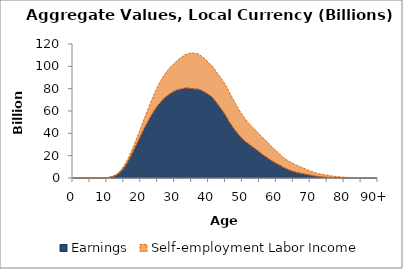
| Category | Earnings | Self-employment Labor Income |
|---|---|---|
| 0 | 0 | 0 |
|  | 0 | 0 |
| 2 | 0 | 0 |
| 3 | 0 | 0 |
| 4 | 0 | 0 |
| 5 | 0 | 0 |
| 6 | 0 | 46.946 |
| 7 | 13.755 | 57.827 |
| 8 | 30.216 | 68.766 |
| 9 | 80.733 | 88.635 |
| 10 | 242.605 | 141.063 |
| 11 | 635.234 | 264.901 |
| 12 | 1421.677 | 516.878 |
| 13 | 2877.866 | 894.584 |
| 14 | 5270.261 | 1371.116 |
| 15 | 8850.062 | 1891.014 |
| 16 | 13448.758 | 2542.195 |
| 17 | 19103.611 | 3258.36 |
| 18 | 25214.749 | 4193.669 |
| 19 | 31665.635 | 5337.689 |
| 20 | 38024.148 | 6816.653 |
| 21 | 44280.08 | 8634.969 |
| 22 | 50017.447 | 10629.712 |
| 23 | 55490.55 | 12769.163 |
| 24 | 60393.669 | 15115.114 |
| 25 | 64831.057 | 17343.843 |
| 26 | 68375.462 | 19229.897 |
| 27 | 71663.163 | 21035.345 |
| 28 | 74050.776 | 22698.869 |
| 29 | 76136.7 | 24008.529 |
| 30 | 77760.376 | 25029.531 |
| 31 | 79219.066 | 26713.715 |
| 32 | 79638.124 | 28309.643 |
| 33 | 80585.312 | 29675.202 |
| 34 | 80531.268 | 30710.684 |
| 35 | 80089.726 | 31962.208 |
| 36 | 79537.963 | 31940.647 |
| 37 | 79585.012 | 31512.155 |
| 38 | 78234.192 | 30672.341 |
| 39 | 76609.497 | 29803.486 |
| 40 | 74780.603 | 28633.872 |
| 41 | 72638.245 | 27865.154 |
| 42 | 68858.409 | 27586.392 |
| 43 | 64761.75 | 27476.864 |
| 44 | 60658.342 | 27557.091 |
| 45 | 56084.006 | 27397.742 |
| 46 | 50886.147 | 26976.225 |
| 47 | 46228.097 | 25787.208 |
| 48 | 42061.125 | 24380.039 |
| 49 | 38274.128 | 22727.387 |
| 50 | 34967.393 | 21359.149 |
| 51 | 32339.606 | 19787.309 |
| 52 | 29971.611 | 18630.016 |
| 53 | 27840.06 | 17712.983 |
| 54 | 25559.453 | 16885.153 |
| 55 | 23254.353 | 15812.603 |
| 56 | 20881.085 | 15317.998 |
| 57 | 18852.84 | 14491.496 |
| 58 | 16676.257 | 13456.153 |
| 59 | 14745.582 | 12292.094 |
| 60 | 13003.94 | 11235.146 |
| 61 | 11448.84 | 9977.372 |
| 62 | 9637.733 | 8982.551 |
| 63 | 8197.881 | 8171.972 |
| 64 | 6925.419 | 7614.812 |
| 65 | 5812.583 | 7036.8 |
| 66 | 4908.248 | 6438.783 |
| 67 | 4313.874 | 5845.017 |
| 68 | 3690.344 | 5193.187 |
| 69 | 3098.017 | 4401.756 |
| 70 | 2512.651 | 3765.44 |
| 71 | 1958.597 | 3240.088 |
| 72 | 1454.85 | 2790.057 |
| 73 | 1097.499 | 2424.221 |
| 74 | 815.213 | 2147.685 |
| 75 | 632.498 | 1828.829 |
| 76 | 496.057 | 1491.281 |
| 77 | 409.052 | 1158.219 |
| 78 | 320.19 | 901.439 |
| 79 | 264.313 | 690.931 |
| 80 | 209.444 | 527.922 |
| 81 | 166.74 | 411.587 |
| 82 | 129.451 | 346.678 |
| 83 | 99.38 | 271.511 |
| 84 | 72.229 | 215.036 |
| 85 | 54.684 | 174.765 |
| 86 | 41.57 | 146.639 |
| 87 | 26.13 | 103.598 |
| 88 | 16.884 | 68.809 |
| 89 | 10.22 | 41.879 |
| 90+ | 5.756 | 24.509 |